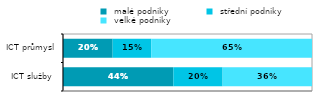
| Category |  malé podniky |  střední podniky |  velké podniky  |
|---|---|---|---|
|   ICT služby  | 0.443 | 0.198 | 0.359 |
|   ICT průmysl | 0.199 | 0.155 | 0.646 |